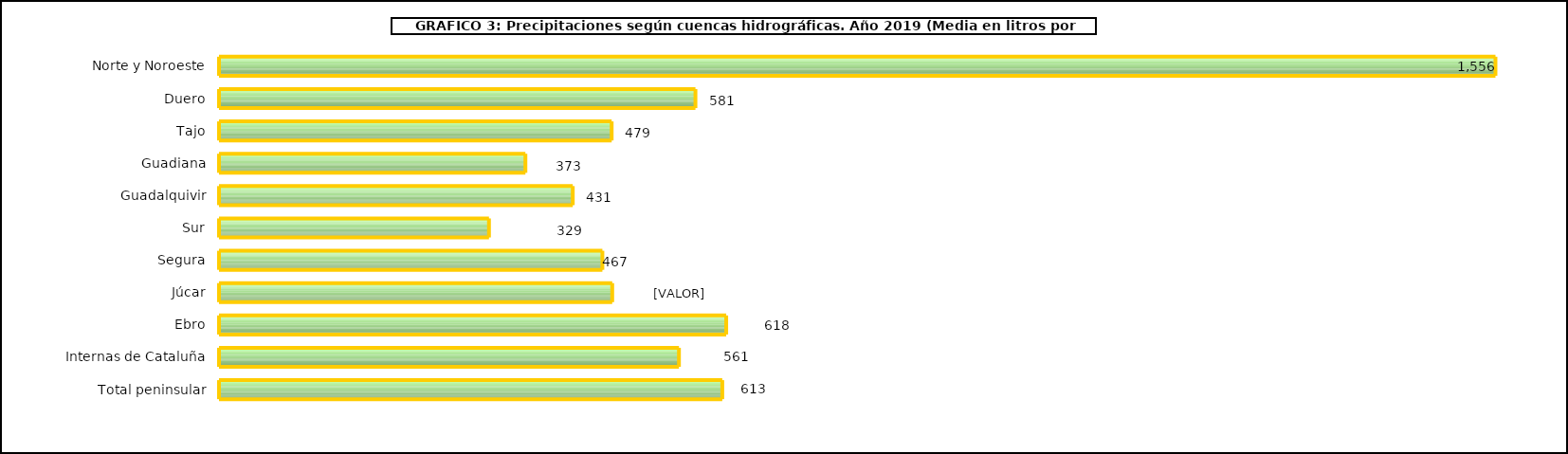
| Category | cuencas |
|---|---|
| 0 | 1555.5 |
| 1 | 580.6 |
| 2 | 478.5 |
| 3 | 373.4 |
| 4 | 431.1 |
| 5 | 329 |
| 6 | 467.2 |
| 7 | 479.2 |
| 8 | 618.1 |
| 9 | 560.5 |
| 10 | 613.3 |